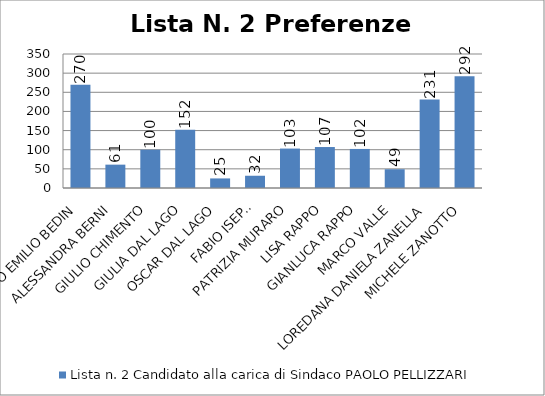
| Category | Lista n. 2 Candidato alla carica di Sindaco PAOLO PELLIZZARI |
|---|---|
| GINO EMILIO BEDIN | 270 |
| ALESSANDRA BERNI | 61 |
| GIULIO CHIMENTO | 100 |
| GIULIA DAL LAGO | 152 |
| OSCAR DAL LAGO | 25 |
| FABIO ISEPPI | 32 |
| PATRIZIA MURARO | 103 |
| LISA RAPPO | 107 |
| GIANLUCA RAPPO | 102 |
| MARCO VALLE | 49 |
| LOREDANA DANIELA ZANELLA | 231 |
| MICHELE ZANOTTO | 292 |